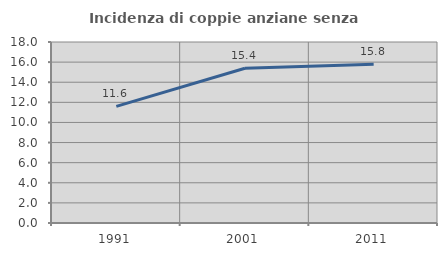
| Category | Incidenza di coppie anziane senza figli  |
|---|---|
| 1991.0 | 11.594 |
| 2001.0 | 15.385 |
| 2011.0 | 15.778 |